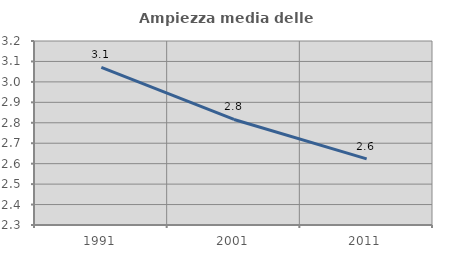
| Category | Ampiezza media delle famiglie |
|---|---|
| 1991.0 | 3.071 |
| 2001.0 | 2.816 |
| 2011.0 | 2.624 |